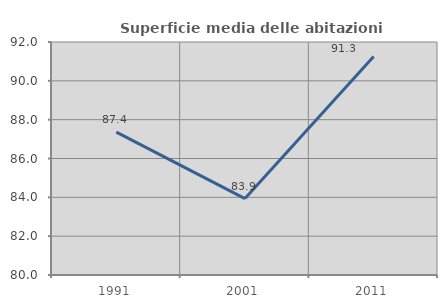
| Category | Superficie media delle abitazioni occupate |
|---|---|
| 1991.0 | 87.357 |
| 2001.0 | 83.934 |
| 2011.0 | 91.258 |